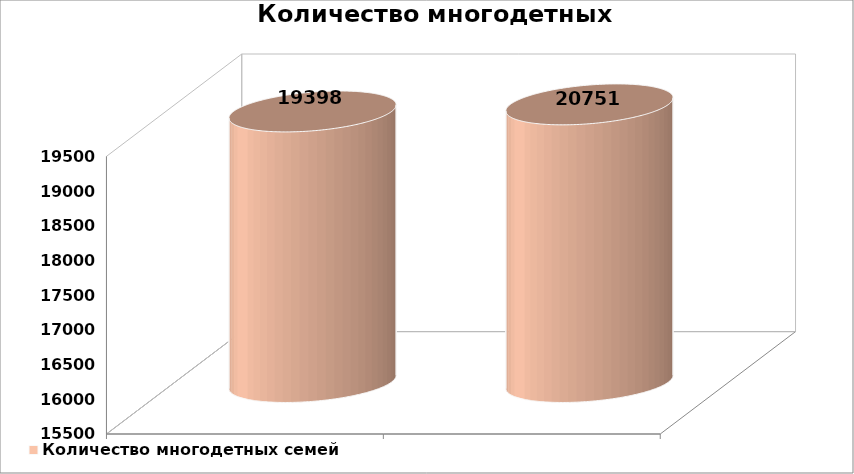
| Category | Количество многодетных семей |
|---|---|
|  | 19398 |
|  | 20751 |